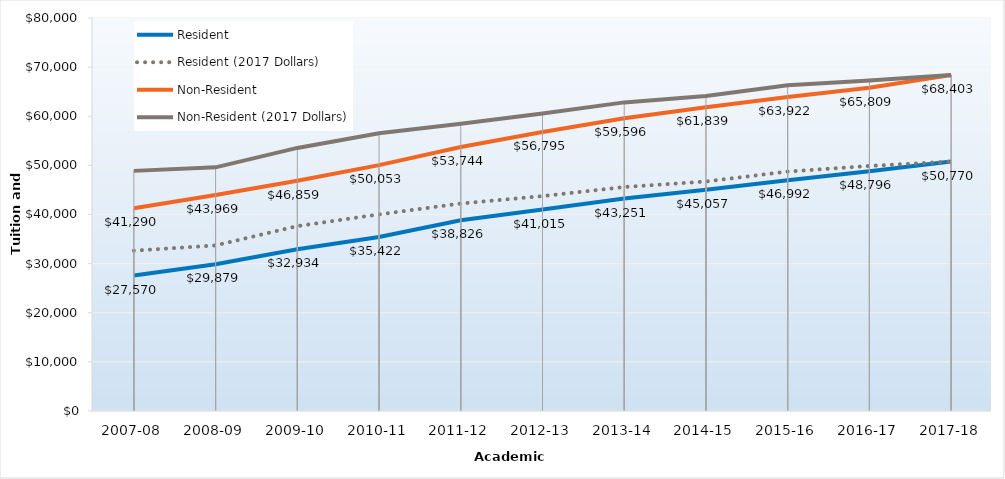
| Category | Resident | Resident (2017 Dollars) | Non-Resident | Non-Resident (2017 Dollars) |
|---|---|---|---|---|
| 2007-08 | 27570 | 32638.5 | 41290 | 48880.79 |
| 2008-09 | 29879 | 33707.85 | 43969 | 49603.42 |
| 2009-10 | 32934 | 37638.44 | 46859 | 53552.55 |
| 2010-11 | 35422 | 40024.09 | 50053 | 56555.98 |
| 2011-12 | 38826 | 42236.49 | 53744 | 58464.89 |
| 2012-13 | 41015 | 43746.65 | 56795 | 60577.62 |
| 2013-14 | 43251 | 45591.35 | 59596 | 62820.79 |
| 2014-15 | 45057 | 46720.48 | 61839 | 64122.07 |
| 2015-16 | 46992 | 48744.54 | 63922 | 66305.93 |
| 2016-17 | 48796 | 49885.6 | 65809 | 67278.49 |
| 2017-18 | 50770 | 50770 | 68403 | 68403 |